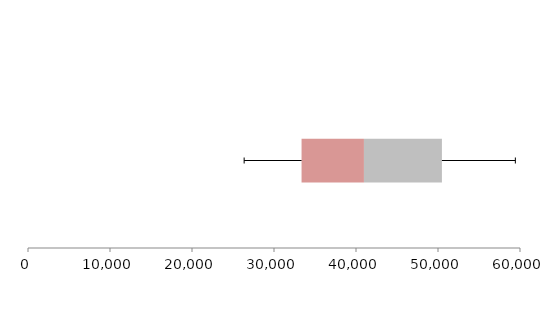
| Category | Series 1 | Series 2 | Series 3 |
|---|---|---|---|
| 0 | 33361.582 | 7607.692 | 9508.471 |